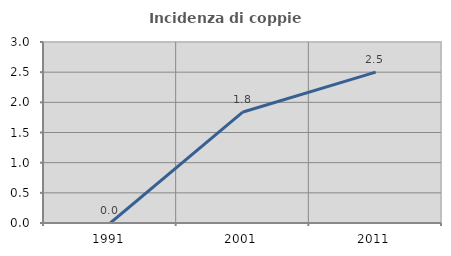
| Category | Incidenza di coppie miste |
|---|---|
| 1991.0 | 0 |
| 2001.0 | 1.84 |
| 2011.0 | 2.5 |